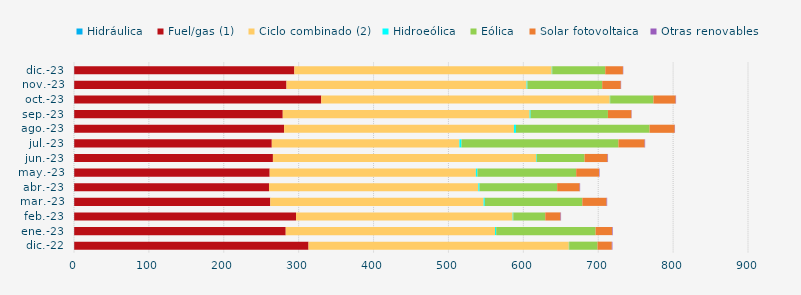
| Category | Hidráulica | Fuel/gas (1) | Ciclo combinado (2) | Hidroeólica | Eólica | Solar fotovoltaica | Otras renovables |
|---|---|---|---|---|---|---|---|
| dic.-22 | 0.289 | 312.877 | 347.662 | 0.367 | 37.913 | 19.061 | 0.785 |
| ene.-23 | 0.275 | 282.444 | 279.419 | 1.65 | 132.728 | 22.121 | 0.784 |
| feb.-23 | 0.254 | 296.212 | 289.333 | 0.829 | 42.671 | 20.383 | 0.711 |
| mar.-23 | 0.282 | 261.841 | 284.831 | 1.572 | 130.237 | 32.429 | 0.738 |
| abr.-23 | 0.276 | 260.1 | 279.544 | 1.573 | 103.686 | 30.034 | 0.631 |
| may.-23 | 0.298 | 261.008 | 275.341 | 2.067 | 131.849 | 30.564 | 0.651 |
| jun.-23 | 0.284 | 265.329 | 351.459 | 0.809 | 63.875 | 30.692 | 0.665 |
| jul.-23 | 0.302 | 263.817 | 250.521 | 2.759 | 209.601 | 35.003 | 0.646 |
| ago.-23 | 0.29 | 280.25 | 306.931 | 2.7 | 178.402 | 33.602 | 0.375 |
| sep.-23 | 0.289 | 278.469 | 329.651 | 1.315 | 103.233 | 31.322 | 0.372 |
| oct.-23 | 0.303 | 329.853 | 385.374 | 0.443 | 57.759 | 29.7 | 0.524 |
| nov.-23 | 0.28 | 283.46 | 320.608 | 1.09 | 99.873 | 24.842 | 0.425 |
| dic.-23 | 0.306 | 293.933 | 343.705 | 0.669 | 70.816 | 23.549 | 0.445 |